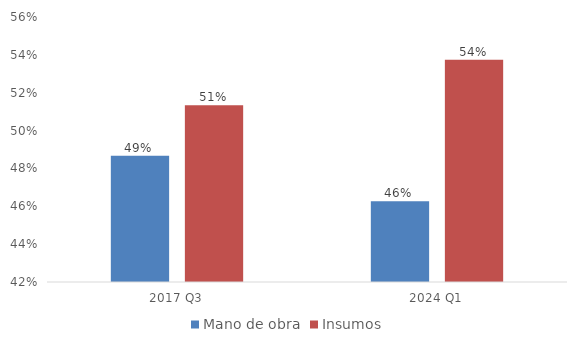
| Category | Mano de obra | Insumos |
|---|---|---|
| 2017 Q3 | 0.487 | 0.513 |
| 2024 Q1 | 0.463 | 0.537 |